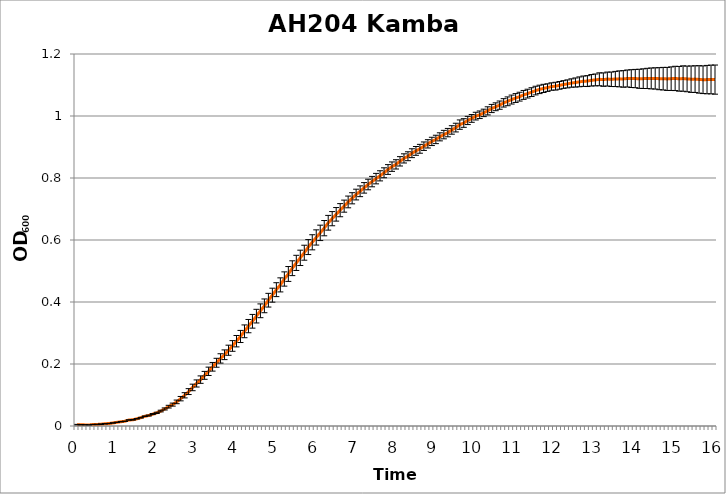
| Category | Series 0 |
|---|---|
| 0.0 | 0.004 |
| nan | 0.004 |
| nan | 0.004 |
| nan | 0.003 |
| nan | 0.005 |
| nan | 0.005 |
| nan | 0.006 |
| nan | 0.007 |
| nan | 0.008 |
| nan | 0.01 |
| 1.0 | 0.012 |
| nan | 0.014 |
| nan | 0.015 |
| nan | 0.019 |
| nan | 0.02 |
| nan | 0.023 |
| nan | 0.027 |
| nan | 0.031 |
| nan | 0.034 |
| nan | 0.038 |
| 2.0 | 0.042 |
| nan | 0.048 |
| nan | 0.055 |
| nan | 0.062 |
| nan | 0.069 |
| nan | 0.078 |
| nan | 0.088 |
| nan | 0.099 |
| nan | 0.111 |
| nan | 0.124 |
| 3.0 | 0.137 |
| nan | 0.15 |
| nan | 0.163 |
| nan | 0.176 |
| nan | 0.191 |
| nan | 0.204 |
| nan | 0.218 |
| nan | 0.23 |
| nan | 0.244 |
| nan | 0.258 |
| 4.0 | 0.274 |
| nan | 0.289 |
| nan | 0.305 |
| nan | 0.322 |
| nan | 0.338 |
| nan | 0.354 |
| nan | 0.372 |
| nan | 0.388 |
| nan | 0.406 |
| nan | 0.422 |
| 5.0 | 0.44 |
| nan | 0.455 |
| nan | 0.474 |
| nan | 0.49 |
| nan | 0.509 |
| nan | 0.526 |
| nan | 0.542 |
| nan | 0.559 |
| nan | 0.577 |
| nan | 0.593 |
| 6.0 | 0.608 |
| nan | 0.623 |
| nan | 0.638 |
| nan | 0.656 |
| nan | 0.669 |
| nan | 0.683 |
| nan | 0.696 |
| nan | 0.709 |
| nan | 0.723 |
| nan | 0.735 |
| 7.0 | 0.747 |
| nan | 0.757 |
| nan | 0.768 |
| nan | 0.779 |
| nan | 0.788 |
| nan | 0.798 |
| nan | 0.807 |
| nan | 0.817 |
| nan | 0.827 |
| nan | 0.837 |
| 8.0 | 0.844 |
| nan | 0.854 |
| nan | 0.863 |
| nan | 0.87 |
| nan | 0.88 |
| nan | 0.887 |
| nan | 0.894 |
| nan | 0.903 |
| nan | 0.91 |
| nan | 0.918 |
| 9.0 | 0.924 |
| nan | 0.933 |
| nan | 0.94 |
| nan | 0.946 |
| nan | 0.955 |
| nan | 0.963 |
| nan | 0.972 |
| nan | 0.977 |
| nan | 0.986 |
| nan | 0.992 |
| 10.0 | 1 |
| nan | 1.004 |
| nan | 1.01 |
| nan | 1.017 |
| nan | 1.024 |
| nan | 1.03 |
| nan | 1.035 |
| nan | 1.042 |
| nan | 1.047 |
| nan | 1.053 |
| 11.0 | 1.058 |
| nan | 1.062 |
| nan | 1.068 |
| nan | 1.072 |
| nan | 1.077 |
| nan | 1.082 |
| nan | 1.086 |
| nan | 1.089 |
| nan | 1.092 |
| nan | 1.095 |
| 12.0 | 1.096 |
| nan | 1.099 |
| nan | 1.102 |
| nan | 1.104 |
| nan | 1.106 |
| nan | 1.108 |
| nan | 1.11 |
| nan | 1.112 |
| nan | 1.113 |
| nan | 1.115 |
| 13.0 | 1.116 |
| nan | 1.118 |
| nan | 1.117 |
| nan | 1.119 |
| nan | 1.118 |
| nan | 1.119 |
| nan | 1.12 |
| nan | 1.12 |
| nan | 1.121 |
| nan | 1.121 |
| 14.0 | 1.121 |
| nan | 1.12 |
| nan | 1.12 |
| nan | 1.121 |
| nan | 1.121 |
| nan | 1.121 |
| nan | 1.12 |
| nan | 1.12 |
| nan | 1.12 |
| nan | 1.12 |
| 15.0 | 1.121 |
| nan | 1.12 |
| nan | 1.121 |
| nan | 1.12 |
| nan | 1.119 |
| nan | 1.119 |
| nan | 1.118 |
| nan | 1.117 |
| nan | 1.117 |
| nan | 1.118 |
| 16.0 | 1.117 |